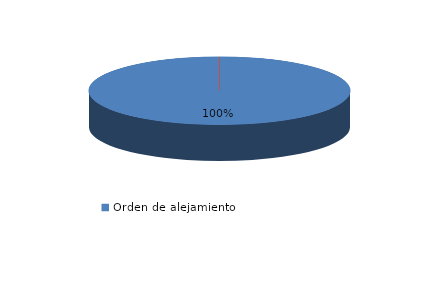
| Category | Series 0 |
|---|---|
| Orden de alejamiento | 42 |
| Orden de protección | 0 |